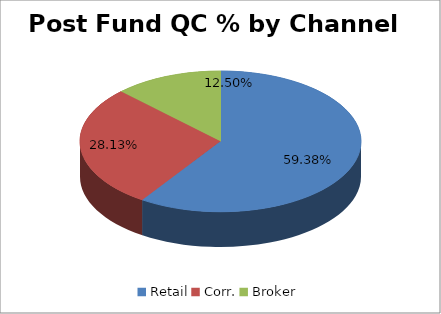
| Category | Post-Closing QC % (Current Month) |
|---|---|
| Retail | 0.594 |
| Corr. | 0.281 |
| Broker | 0.125 |